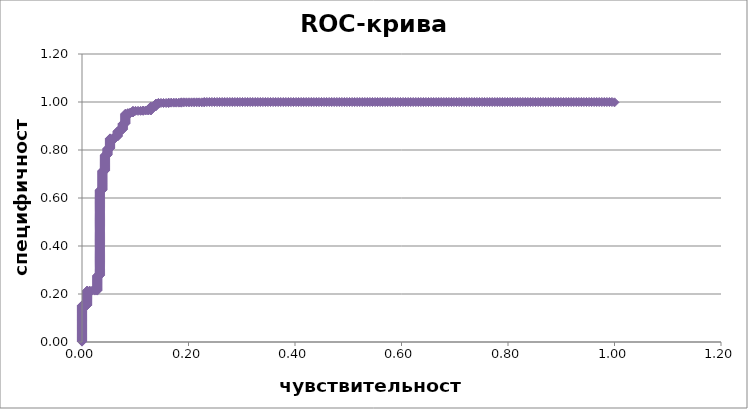
| Category | ROC-кривая |
|---|---|
| 0.0 | 0.001 |
| 0.0 | 0.003 |
| 0.0 | 0.004 |
| 0.0 | 0.005 |
| 0.0 | 0.007 |
| 0.0 | 0.008 |
| 0.0 | 0.01 |
| 0.0 | 0.011 |
| 0.0 | 0.012 |
| 0.0 | 0.014 |
| 0.0 | 0.015 |
| 0.0 | 0.016 |
| 0.0 | 0.018 |
| 0.0 | 0.019 |
| 0.0 | 0.02 |
| 0.0 | 0.022 |
| 0.0 | 0.023 |
| 0.0 | 0.025 |
| 0.0 | 0.026 |
| 0.0 | 0.027 |
| 0.0 | 0.029 |
| 0.0 | 0.03 |
| 0.0 | 0.031 |
| 0.0 | 0.033 |
| 0.0 | 0.034 |
| 0.0 | 0.035 |
| 0.0 | 0.037 |
| 0.0 | 0.038 |
| 0.0 | 0.04 |
| 0.0 | 0.041 |
| 0.0 | 0.042 |
| 0.0 | 0.044 |
| 0.0 | 0.045 |
| 0.0 | 0.046 |
| 0.0 | 0.048 |
| 0.0 | 0.049 |
| 0.0 | 0.05 |
| 0.0 | 0.052 |
| 0.0 | 0.053 |
| 0.0 | 0.055 |
| 0.0 | 0.056 |
| 0.0 | 0.057 |
| 0.0 | 0.059 |
| 0.0 | 0.06 |
| 0.0 | 0.061 |
| 0.0 | 0.063 |
| 0.0 | 0.064 |
| 0.0 | 0.065 |
| 0.0 | 0.067 |
| 0.0 | 0.068 |
| 0.0 | 0.07 |
| 0.0 | 0.071 |
| 0.0 | 0.072 |
| 0.0 | 0.074 |
| 0.0 | 0.075 |
| 0.0 | 0.076 |
| 0.0 | 0.078 |
| 0.0 | 0.079 |
| 0.0 | 0.08 |
| 0.0 | 0.082 |
| 0.0 | 0.083 |
| 0.0 | 0.085 |
| 0.0 | 0.086 |
| 0.0 | 0.087 |
| 0.0 | 0.089 |
| 0.0 | 0.09 |
| 0.0 | 0.091 |
| 0.0 | 0.093 |
| 0.0 | 0.094 |
| 0.0 | 0.095 |
| 0.0 | 0.097 |
| 0.0 | 0.098 |
| 0.0 | 0.1 |
| 0.0 | 0.101 |
| 0.0 | 0.102 |
| 0.0 | 0.104 |
| 0.0 | 0.105 |
| 0.0 | 0.106 |
| 0.0 | 0.108 |
| 0.0 | 0.109 |
| 0.0 | 0.111 |
| 0.0 | 0.112 |
| 0.0 | 0.113 |
| 0.0 | 0.115 |
| 0.0 | 0.116 |
| 0.0 | 0.117 |
| 0.0 | 0.119 |
| 0.0 | 0.12 |
| 0.0 | 0.121 |
| 0.0 | 0.123 |
| 0.0 | 0.124 |
| 0.0 | 0.126 |
| 0.0 | 0.127 |
| 0.0 | 0.128 |
| 0.0 | 0.13 |
| 0.0 | 0.131 |
| 0.0 | 0.132 |
| 0.0 | 0.134 |
| 0.0 | 0.135 |
| 0.0 | 0.136 |
| 0.0 | 0.138 |
| 0.0 | 0.139 |
| 0.0 | 0.141 |
| 0.0 | 0.142 |
| 0.0 | 0.143 |
| 0.0 | 0.145 |
| 0.0 | 0.146 |
| 0.0 | 0.147 |
| 0.0 | 0.149 |
| 0.0 | 0.15 |
| 0.0 | 0.151 |
| 0.0 | 0.153 |
| 0.004784688995215311 | 0.153 |
| 0.009569377990430622 | 0.153 |
| 0.009569377990430622 | 0.154 |
| 0.009569377990430622 | 0.156 |
| 0.009569377990430622 | 0.157 |
| 0.009569377990430622 | 0.158 |
| 0.009569377990430622 | 0.16 |
| 0.009569377990430622 | 0.161 |
| 0.009569377990430622 | 0.162 |
| 0.009569377990430622 | 0.164 |
| 0.009569377990430622 | 0.165 |
| 0.009569377990430622 | 0.166 |
| 0.009569377990430622 | 0.168 |
| 0.009569377990430622 | 0.169 |
| 0.009569377990430622 | 0.171 |
| 0.009569377990430622 | 0.172 |
| 0.009569377990430622 | 0.173 |
| 0.009569377990430622 | 0.175 |
| 0.009569377990430622 | 0.176 |
| 0.009569377990430622 | 0.177 |
| 0.009569377990430622 | 0.179 |
| 0.009569377990430622 | 0.18 |
| 0.009569377990430622 | 0.181 |
| 0.009569377990430622 | 0.183 |
| 0.009569377990430622 | 0.184 |
| 0.009569377990430622 | 0.186 |
| 0.009569377990430622 | 0.187 |
| 0.009569377990430622 | 0.188 |
| 0.009569377990430622 | 0.19 |
| 0.009569377990430622 | 0.191 |
| 0.009569377990430622 | 0.192 |
| 0.009569377990430622 | 0.194 |
| 0.009569377990430622 | 0.195 |
| 0.009569377990430622 | 0.196 |
| 0.009569377990430622 | 0.198 |
| 0.009569377990430622 | 0.199 |
| 0.009569377990430622 | 0.201 |
| 0.009569377990430622 | 0.202 |
| 0.009569377990430622 | 0.203 |
| 0.009569377990430622 | 0.205 |
| 0.009569377990430622 | 0.206 |
| 0.009569377990430622 | 0.207 |
| 0.009569377990430622 | 0.209 |
| 0.009569377990430622 | 0.21 |
| 0.009569377990430622 | 0.211 |
| 0.009569377990430622 | 0.213 |
| 0.009569377990430622 | 0.214 |
| 0.014354066985645933 | 0.214 |
| 0.019138755980861243 | 0.214 |
| 0.023923444976076555 | 0.214 |
| 0.028708133971291867 | 0.214 |
| 0.028708133971291867 | 0.216 |
| 0.028708133971291867 | 0.217 |
| 0.028708133971291867 | 0.218 |
| 0.028708133971291867 | 0.22 |
| 0.028708133971291867 | 0.221 |
| 0.028708133971291867 | 0.222 |
| 0.028708133971291867 | 0.224 |
| 0.028708133971291867 | 0.225 |
| 0.028708133971291867 | 0.226 |
| 0.028708133971291867 | 0.228 |
| 0.028708133971291867 | 0.229 |
| 0.028708133971291867 | 0.231 |
| 0.028708133971291867 | 0.232 |
| 0.028708133971291867 | 0.233 |
| 0.028708133971291867 | 0.235 |
| 0.028708133971291867 | 0.236 |
| 0.028708133971291867 | 0.237 |
| 0.028708133971291867 | 0.239 |
| 0.028708133971291867 | 0.24 |
| 0.028708133971291867 | 0.241 |
| 0.028708133971291867 | 0.243 |
| 0.028708133971291867 | 0.244 |
| 0.028708133971291867 | 0.246 |
| 0.028708133971291867 | 0.247 |
| 0.028708133971291867 | 0.248 |
| 0.028708133971291867 | 0.25 |
| 0.028708133971291867 | 0.251 |
| 0.028708133971291867 | 0.252 |
| 0.028708133971291867 | 0.254 |
| 0.028708133971291867 | 0.255 |
| 0.028708133971291867 | 0.256 |
| 0.028708133971291867 | 0.258 |
| 0.028708133971291867 | 0.259 |
| 0.028708133971291867 | 0.261 |
| 0.028708133971291867 | 0.262 |
| 0.028708133971291867 | 0.263 |
| 0.028708133971291867 | 0.265 |
| 0.028708133971291867 | 0.266 |
| 0.028708133971291867 | 0.267 |
| 0.028708133971291867 | 0.269 |
| 0.028708133971291867 | 0.27 |
| 0.028708133971291867 | 0.271 |
| 0.028708133971291867 | 0.273 |
| 0.028708133971291867 | 0.274 |
| 0.028708133971291867 | 0.276 |
| 0.028708133971291867 | 0.277 |
| 0.03349282296650718 | 0.277 |
| 0.03349282296650718 | 0.278 |
| 0.03349282296650718 | 0.28 |
| 0.03349282296650718 | 0.281 |
| 0.03349282296650718 | 0.282 |
| 0.03349282296650718 | 0.284 |
| 0.03349282296650718 | 0.285 |
| 0.03349282296650718 | 0.286 |
| 0.03349282296650718 | 0.288 |
| 0.03349282296650718 | 0.289 |
| 0.03349282296650718 | 0.291 |
| 0.03349282296650718 | 0.292 |
| 0.03349282296650718 | 0.293 |
| 0.03349282296650718 | 0.295 |
| 0.03349282296650718 | 0.296 |
| 0.03349282296650718 | 0.297 |
| 0.03349282296650718 | 0.299 |
| 0.03349282296650718 | 0.3 |
| 0.03349282296650718 | 0.302 |
| 0.03349282296650718 | 0.303 |
| 0.03349282296650718 | 0.304 |
| 0.03349282296650718 | 0.306 |
| 0.03349282296650718 | 0.307 |
| 0.03349282296650718 | 0.308 |
| 0.03349282296650718 | 0.31 |
| 0.03349282296650718 | 0.311 |
| 0.03349282296650718 | 0.312 |
| 0.03349282296650718 | 0.314 |
| 0.03349282296650718 | 0.315 |
| 0.03349282296650718 | 0.317 |
| 0.03349282296650718 | 0.318 |
| 0.03349282296650718 | 0.319 |
| 0.03349282296650718 | 0.321 |
| 0.03349282296650718 | 0.322 |
| 0.03349282296650718 | 0.323 |
| 0.03349282296650718 | 0.325 |
| 0.03349282296650718 | 0.326 |
| 0.03349282296650718 | 0.327 |
| 0.03349282296650718 | 0.329 |
| 0.03349282296650718 | 0.33 |
| 0.03349282296650718 | 0.332 |
| 0.03349282296650718 | 0.333 |
| 0.03349282296650718 | 0.334 |
| 0.03349282296650718 | 0.336 |
| 0.03349282296650718 | 0.337 |
| 0.03349282296650718 | 0.338 |
| 0.03349282296650718 | 0.34 |
| 0.03349282296650718 | 0.341 |
| 0.03349282296650718 | 0.342 |
| 0.03349282296650718 | 0.344 |
| 0.03349282296650718 | 0.345 |
| 0.03349282296650718 | 0.347 |
| 0.03349282296650718 | 0.348 |
| 0.03349282296650718 | 0.349 |
| 0.03349282296650718 | 0.351 |
| 0.03349282296650718 | 0.352 |
| 0.03349282296650718 | 0.353 |
| 0.03349282296650718 | 0.355 |
| 0.03349282296650718 | 0.356 |
| 0.03349282296650718 | 0.357 |
| 0.03349282296650718 | 0.359 |
| 0.03349282296650718 | 0.36 |
| 0.03349282296650718 | 0.362 |
| 0.03349282296650718 | 0.363 |
| 0.03349282296650718 | 0.364 |
| 0.03349282296650718 | 0.366 |
| 0.03349282296650718 | 0.367 |
| 0.03349282296650718 | 0.368 |
| 0.03349282296650718 | 0.37 |
| 0.03349282296650718 | 0.371 |
| 0.03349282296650718 | 0.372 |
| 0.03349282296650718 | 0.374 |
| 0.03349282296650718 | 0.375 |
| 0.03349282296650718 | 0.377 |
| 0.03349282296650718 | 0.378 |
| 0.03349282296650718 | 0.379 |
| 0.03349282296650718 | 0.381 |
| 0.03349282296650718 | 0.382 |
| 0.03349282296650718 | 0.383 |
| 0.03349282296650718 | 0.385 |
| 0.03349282296650718 | 0.386 |
| 0.03349282296650718 | 0.387 |
| 0.03349282296650718 | 0.389 |
| 0.03349282296650718 | 0.39 |
| 0.03349282296650718 | 0.392 |
| 0.03349282296650718 | 0.393 |
| 0.03349282296650718 | 0.394 |
| 0.03349282296650718 | 0.396 |
| 0.03349282296650718 | 0.397 |
| 0.03349282296650718 | 0.398 |
| 0.03349282296650718 | 0.4 |
| 0.03349282296650718 | 0.401 |
| 0.03349282296650718 | 0.402 |
| 0.03349282296650718 | 0.404 |
| 0.03349282296650718 | 0.405 |
| 0.03349282296650718 | 0.407 |
| 0.03349282296650718 | 0.408 |
| 0.03349282296650718 | 0.409 |
| 0.03349282296650718 | 0.411 |
| 0.03349282296650718 | 0.412 |
| 0.03349282296650718 | 0.413 |
| 0.03349282296650718 | 0.415 |
| 0.03349282296650718 | 0.416 |
| 0.03349282296650718 | 0.417 |
| 0.03349282296650718 | 0.419 |
| 0.03349282296650718 | 0.42 |
| 0.03349282296650718 | 0.422 |
| 0.03349282296650718 | 0.423 |
| 0.03349282296650718 | 0.424 |
| 0.03349282296650718 | 0.426 |
| 0.03349282296650718 | 0.427 |
| 0.03349282296650718 | 0.428 |
| 0.03349282296650718 | 0.43 |
| 0.03349282296650718 | 0.431 |
| 0.03349282296650718 | 0.432 |
| 0.03349282296650718 | 0.434 |
| 0.03349282296650718 | 0.435 |
| 0.03349282296650718 | 0.437 |
| 0.03349282296650718 | 0.438 |
| 0.03349282296650718 | 0.439 |
| 0.03349282296650718 | 0.441 |
| 0.03349282296650718 | 0.442 |
| 0.03349282296650718 | 0.443 |
| 0.03349282296650718 | 0.445 |
| 0.03349282296650718 | 0.446 |
| 0.03349282296650718 | 0.447 |
| 0.03349282296650718 | 0.449 |
| 0.03349282296650718 | 0.45 |
| 0.03349282296650718 | 0.452 |
| 0.03349282296650718 | 0.453 |
| 0.03349282296650718 | 0.454 |
| 0.03349282296650718 | 0.456 |
| 0.03349282296650718 | 0.457 |
| 0.03349282296650718 | 0.458 |
| 0.03349282296650718 | 0.46 |
| 0.03349282296650718 | 0.461 |
| 0.03349282296650718 | 0.462 |
| 0.03349282296650718 | 0.464 |
| 0.03349282296650718 | 0.465 |
| 0.03349282296650718 | 0.467 |
| 0.03349282296650718 | 0.468 |
| 0.03349282296650718 | 0.469 |
| 0.03349282296650718 | 0.471 |
| 0.03349282296650718 | 0.472 |
| 0.03349282296650718 | 0.473 |
| 0.03349282296650718 | 0.475 |
| 0.03349282296650718 | 0.476 |
| 0.03349282296650718 | 0.477 |
| 0.03349282296650718 | 0.479 |
| 0.03349282296650718 | 0.48 |
| 0.03349282296650718 | 0.482 |
| 0.03349282296650718 | 0.483 |
| 0.03349282296650718 | 0.484 |
| 0.03349282296650718 | 0.486 |
| 0.03349282296650718 | 0.487 |
| 0.03349282296650718 | 0.488 |
| 0.03349282296650718 | 0.49 |
| 0.03349282296650718 | 0.491 |
| 0.03349282296650718 | 0.492 |
| 0.03349282296650718 | 0.494 |
| 0.03349282296650718 | 0.495 |
| 0.03349282296650718 | 0.497 |
| 0.03349282296650718 | 0.498 |
| 0.03349282296650718 | 0.499 |
| 0.03349282296650718 | 0.501 |
| 0.03349282296650718 | 0.502 |
| 0.03349282296650718 | 0.503 |
| 0.03349282296650718 | 0.505 |
| 0.03349282296650718 | 0.506 |
| 0.03349282296650718 | 0.508 |
| 0.03349282296650718 | 0.509 |
| 0.03349282296650718 | 0.51 |
| 0.03349282296650718 | 0.512 |
| 0.03349282296650718 | 0.513 |
| 0.03349282296650718 | 0.514 |
| 0.03349282296650718 | 0.516 |
| 0.03349282296650718 | 0.517 |
| 0.03349282296650718 | 0.518 |
| 0.03349282296650718 | 0.52 |
| 0.03349282296650718 | 0.521 |
| 0.03349282296650718 | 0.523 |
| 0.03349282296650718 | 0.524 |
| 0.03349282296650718 | 0.525 |
| 0.03349282296650718 | 0.527 |
| 0.03349282296650718 | 0.528 |
| 0.03349282296650718 | 0.529 |
| 0.03349282296650718 | 0.531 |
| 0.03349282296650718 | 0.532 |
| 0.03349282296650718 | 0.533 |
| 0.03349282296650718 | 0.535 |
| 0.03349282296650718 | 0.536 |
| 0.03349282296650718 | 0.538 |
| 0.03349282296650718 | 0.539 |
| 0.03349282296650718 | 0.54 |
| 0.03349282296650718 | 0.542 |
| 0.03349282296650718 | 0.543 |
| 0.03349282296650718 | 0.544 |
| 0.03349282296650718 | 0.546 |
| 0.03349282296650718 | 0.547 |
| 0.03349282296650718 | 0.548 |
| 0.03349282296650718 | 0.55 |
| 0.03349282296650718 | 0.551 |
| 0.03349282296650718 | 0.553 |
| 0.03349282296650718 | 0.554 |
| 0.03349282296650718 | 0.555 |
| 0.03349282296650718 | 0.557 |
| 0.03349282296650718 | 0.558 |
| 0.03349282296650718 | 0.559 |
| 0.03349282296650718 | 0.561 |
| 0.03349282296650718 | 0.562 |
| 0.03349282296650718 | 0.563 |
| 0.03349282296650718 | 0.565 |
| 0.03349282296650718 | 0.566 |
| 0.03349282296650718 | 0.568 |
| 0.03349282296650718 | 0.569 |
| 0.03349282296650718 | 0.57 |
| 0.03349282296650718 | 0.572 |
| 0.03349282296650718 | 0.573 |
| 0.03349282296650718 | 0.574 |
| 0.03349282296650718 | 0.576 |
| 0.03349282296650718 | 0.577 |
| 0.03349282296650718 | 0.578 |
| 0.03349282296650718 | 0.58 |
| 0.03349282296650718 | 0.581 |
| 0.03349282296650718 | 0.583 |
| 0.03349282296650718 | 0.584 |
| 0.03349282296650718 | 0.585 |
| 0.03349282296650718 | 0.587 |
| 0.03349282296650718 | 0.588 |
| 0.03349282296650718 | 0.589 |
| 0.03349282296650718 | 0.591 |
| 0.03349282296650718 | 0.592 |
| 0.03349282296650718 | 0.593 |
| 0.03349282296650718 | 0.595 |
| 0.03349282296650718 | 0.596 |
| 0.03349282296650718 | 0.598 |
| 0.03349282296650718 | 0.599 |
| 0.03349282296650718 | 0.6 |
| 0.03349282296650718 | 0.602 |
| 0.03349282296650718 | 0.603 |
| 0.03349282296650718 | 0.604 |
| 0.03349282296650718 | 0.606 |
| 0.03349282296650718 | 0.607 |
| 0.03349282296650718 | 0.608 |
| 0.03349282296650718 | 0.61 |
| 0.03349282296650718 | 0.611 |
| 0.03349282296650718 | 0.613 |
| 0.03349282296650718 | 0.614 |
| 0.03349282296650718 | 0.615 |
| 0.03349282296650718 | 0.617 |
| 0.03349282296650718 | 0.618 |
| 0.03349282296650718 | 0.619 |
| 0.03349282296650718 | 0.621 |
| 0.03349282296650718 | 0.622 |
| 0.03349282296650718 | 0.623 |
| 0.03349282296650718 | 0.625 |
| 0.03349282296650718 | 0.626 |
| 0.03349282296650718 | 0.628 |
| 0.03349282296650718 | 0.629 |
| 0.03349282296650718 | 0.63 |
| 0.03349282296650718 | 0.632 |
| 0.03349282296650718 | 0.633 |
| 0.03827751196172249 | 0.633 |
| 0.03827751196172249 | 0.634 |
| 0.03827751196172249 | 0.636 |
| 0.03827751196172249 | 0.637 |
| 0.03827751196172249 | 0.638 |
| 0.03827751196172249 | 0.64 |
| 0.03827751196172249 | 0.641 |
| 0.03827751196172249 | 0.643 |
| 0.03827751196172249 | 0.644 |
| 0.03827751196172249 | 0.645 |
| 0.03827751196172249 | 0.647 |
| 0.03827751196172249 | 0.648 |
| 0.03827751196172249 | 0.649 |
| 0.03827751196172249 | 0.651 |
| 0.03827751196172249 | 0.652 |
| 0.03827751196172249 | 0.653 |
| 0.03827751196172249 | 0.655 |
| 0.03827751196172249 | 0.656 |
| 0.03827751196172249 | 0.658 |
| 0.03827751196172249 | 0.659 |
| 0.03827751196172249 | 0.66 |
| 0.03827751196172249 | 0.662 |
| 0.03827751196172249 | 0.663 |
| 0.03827751196172249 | 0.664 |
| 0.03827751196172249 | 0.666 |
| 0.03827751196172249 | 0.667 |
| 0.03827751196172249 | 0.668 |
| 0.03827751196172249 | 0.67 |
| 0.03827751196172249 | 0.671 |
| 0.03827751196172249 | 0.673 |
| 0.03827751196172249 | 0.674 |
| 0.03827751196172249 | 0.675 |
| 0.03827751196172249 | 0.677 |
| 0.03827751196172249 | 0.678 |
| 0.03827751196172249 | 0.679 |
| 0.03827751196172249 | 0.681 |
| 0.03827751196172249 | 0.682 |
| 0.03827751196172249 | 0.683 |
| 0.03827751196172249 | 0.685 |
| 0.03827751196172249 | 0.686 |
| 0.03827751196172249 | 0.688 |
| 0.03827751196172249 | 0.689 |
| 0.03827751196172249 | 0.69 |
| 0.03827751196172249 | 0.692 |
| 0.03827751196172249 | 0.693 |
| 0.03827751196172249 | 0.694 |
| 0.03827751196172249 | 0.696 |
| 0.03827751196172249 | 0.697 |
| 0.03827751196172249 | 0.698 |
| 0.03827751196172249 | 0.7 |
| 0.03827751196172249 | 0.701 |
| 0.03827751196172249 | 0.703 |
| 0.03827751196172249 | 0.704 |
| 0.03827751196172249 | 0.705 |
| 0.03827751196172249 | 0.707 |
| 0.03827751196172249 | 0.708 |
| 0.03827751196172249 | 0.709 |
| 0.03827751196172249 | 0.711 |
| 0.03827751196172249 | 0.712 |
| 0.03827751196172249 | 0.714 |
| 0.0430622009569378 | 0.714 |
| 0.0430622009569378 | 0.715 |
| 0.0430622009569378 | 0.716 |
| 0.0430622009569378 | 0.718 |
| 0.0430622009569378 | 0.719 |
| 0.0430622009569378 | 0.72 |
| 0.0430622009569378 | 0.722 |
| 0.0430622009569378 | 0.723 |
| 0.0430622009569378 | 0.724 |
| 0.0430622009569378 | 0.726 |
| 0.0430622009569378 | 0.727 |
| 0.0430622009569378 | 0.729 |
| 0.0430622009569378 | 0.73 |
| 0.0430622009569378 | 0.731 |
| 0.0430622009569378 | 0.733 |
| 0.0430622009569378 | 0.734 |
| 0.0430622009569378 | 0.735 |
| 0.0430622009569378 | 0.737 |
| 0.0430622009569378 | 0.738 |
| 0.0430622009569378 | 0.739 |
| 0.0430622009569378 | 0.741 |
| 0.0430622009569378 | 0.742 |
| 0.0430622009569378 | 0.744 |
| 0.0430622009569378 | 0.745 |
| 0.0430622009569378 | 0.746 |
| 0.0430622009569378 | 0.748 |
| 0.0430622009569378 | 0.749 |
| 0.0430622009569378 | 0.75 |
| 0.0430622009569378 | 0.752 |
| 0.0430622009569378 | 0.753 |
| 0.0430622009569378 | 0.754 |
| 0.0430622009569378 | 0.756 |
| 0.0430622009569378 | 0.757 |
| 0.0430622009569378 | 0.759 |
| 0.0430622009569378 | 0.76 |
| 0.0430622009569378 | 0.761 |
| 0.0430622009569378 | 0.763 |
| 0.0430622009569378 | 0.764 |
| 0.0430622009569378 | 0.765 |
| 0.0430622009569378 | 0.767 |
| 0.0430622009569378 | 0.768 |
| 0.0430622009569378 | 0.769 |
| 0.0430622009569378 | 0.771 |
| 0.0430622009569378 | 0.772 |
| 0.0430622009569378 | 0.774 |
| 0.0430622009569378 | 0.775 |
| 0.0430622009569378 | 0.776 |
| 0.0430622009569378 | 0.778 |
| 0.0430622009569378 | 0.779 |
| 0.04784688995215311 | 0.779 |
| 0.04784688995215311 | 0.78 |
| 0.04784688995215311 | 0.782 |
| 0.04784688995215311 | 0.783 |
| 0.04784688995215311 | 0.784 |
| 0.04784688995215311 | 0.786 |
| 0.04784688995215311 | 0.787 |
| 0.04784688995215311 | 0.789 |
| 0.04784688995215311 | 0.79 |
| 0.04784688995215311 | 0.791 |
| 0.04784688995215311 | 0.793 |
| 0.04784688995215311 | 0.794 |
| 0.04784688995215311 | 0.795 |
| 0.04784688995215311 | 0.797 |
| 0.04784688995215311 | 0.798 |
| 0.04784688995215311 | 0.799 |
| 0.04784688995215311 | 0.801 |
| 0.04784688995215311 | 0.802 |
| 0.04784688995215311 | 0.804 |
| 0.04784688995215311 | 0.805 |
| 0.04784688995215311 | 0.806 |
| 0.05263157894736842 | 0.806 |
| 0.05263157894736842 | 0.808 |
| 0.05263157894736842 | 0.809 |
| 0.05263157894736842 | 0.81 |
| 0.05263157894736842 | 0.812 |
| 0.05263157894736842 | 0.813 |
| 0.05263157894736842 | 0.814 |
| 0.05263157894736842 | 0.816 |
| 0.05263157894736842 | 0.817 |
| 0.05263157894736842 | 0.819 |
| 0.05263157894736842 | 0.82 |
| 0.05263157894736842 | 0.821 |
| 0.05263157894736842 | 0.823 |
| 0.05263157894736842 | 0.824 |
| 0.05263157894736842 | 0.825 |
| 0.05263157894736842 | 0.827 |
| 0.05263157894736842 | 0.828 |
| 0.05263157894736842 | 0.829 |
| 0.05263157894736842 | 0.831 |
| 0.05263157894736842 | 0.832 |
| 0.05263157894736842 | 0.834 |
| 0.05263157894736842 | 0.835 |
| 0.05263157894736842 | 0.836 |
| 0.05263157894736842 | 0.838 |
| 0.05263157894736842 | 0.839 |
| 0.05263157894736842 | 0.84 |
| 0.05263157894736842 | 0.842 |
| 0.05263157894736842 | 0.843 |
| 0.05263157894736842 | 0.844 |
| 0.05263157894736842 | 0.846 |
| 0.05263157894736842 | 0.847 |
| 0.05263157894736842 | 0.849 |
| 0.05741626794258373 | 0.849 |
| 0.06220095693779904 | 0.849 |
| 0.06220095693779904 | 0.85 |
| 0.06220095693779904 | 0.851 |
| 0.06220095693779904 | 0.853 |
| 0.06220095693779904 | 0.854 |
| 0.06220095693779904 | 0.855 |
| 0.06220095693779904 | 0.857 |
| 0.06698564593301436 | 0.857 |
| 0.06698564593301436 | 0.858 |
| 0.06698564593301436 | 0.859 |
| 0.06698564593301436 | 0.861 |
| 0.06698564593301436 | 0.862 |
| 0.06698564593301436 | 0.864 |
| 0.06698564593301436 | 0.865 |
| 0.06698564593301436 | 0.866 |
| 0.06698564593301436 | 0.868 |
| 0.06698564593301436 | 0.869 |
| 0.06698564593301436 | 0.87 |
| 0.06698564593301436 | 0.872 |
| 0.06698564593301436 | 0.873 |
| 0.06698564593301436 | 0.874 |
| 0.06698564593301436 | 0.876 |
| 0.06698564593301436 | 0.877 |
| 0.06698564593301436 | 0.879 |
| 0.07177033492822966 | 0.879 |
| 0.07177033492822966 | 0.88 |
| 0.07177033492822966 | 0.881 |
| 0.07177033492822966 | 0.883 |
| 0.07177033492822966 | 0.884 |
| 0.07177033492822966 | 0.885 |
| 0.07655502392344497 | 0.885 |
| 0.07655502392344497 | 0.887 |
| 0.07655502392344497 | 0.888 |
| 0.07655502392344497 | 0.889 |
| 0.07655502392344497 | 0.891 |
| 0.07655502392344497 | 0.892 |
| 0.07655502392344497 | 0.894 |
| 0.07655502392344497 | 0.895 |
| 0.07655502392344497 | 0.896 |
| 0.07655502392344497 | 0.898 |
| 0.07655502392344497 | 0.899 |
| 0.07655502392344497 | 0.9 |
| 0.07655502392344497 | 0.902 |
| 0.07655502392344497 | 0.903 |
| 0.07655502392344497 | 0.905 |
| 0.07655502392344497 | 0.906 |
| 0.07655502392344497 | 0.907 |
| 0.07655502392344497 | 0.909 |
| 0.07655502392344497 | 0.91 |
| 0.08133971291866028 | 0.91 |
| 0.08133971291866028 | 0.911 |
| 0.08133971291866028 | 0.913 |
| 0.08133971291866028 | 0.914 |
| 0.08133971291866028 | 0.915 |
| 0.08133971291866028 | 0.917 |
| 0.08133971291866028 | 0.918 |
| 0.08133971291866028 | 0.92 |
| 0.08133971291866028 | 0.921 |
| 0.08133971291866028 | 0.922 |
| 0.08133971291866028 | 0.924 |
| 0.08133971291866028 | 0.925 |
| 0.08133971291866028 | 0.926 |
| 0.08133971291866028 | 0.928 |
| 0.08133971291866028 | 0.929 |
| 0.08133971291866028 | 0.93 |
| 0.08133971291866028 | 0.932 |
| 0.08133971291866028 | 0.933 |
| 0.08133971291866028 | 0.935 |
| 0.08133971291866028 | 0.936 |
| 0.08133971291866028 | 0.937 |
| 0.08133971291866028 | 0.939 |
| 0.08133971291866028 | 0.94 |
| 0.08133971291866028 | 0.941 |
| 0.08133971291866028 | 0.943 |
| 0.08133971291866028 | 0.944 |
| 0.08133971291866028 | 0.945 |
| 0.08133971291866028 | 0.947 |
| 0.08133971291866028 | 0.948 |
| 0.08133971291866028 | 0.95 |
| 0.08133971291866028 | 0.951 |
| 0.0861244019138756 | 0.951 |
| 0.0861244019138756 | 0.952 |
| 0.0861244019138756 | 0.954 |
| 0.09090909090909091 | 0.954 |
| 0.09090909090909091 | 0.955 |
| 0.09090909090909091 | 0.956 |
| 0.09569377990430622 | 0.956 |
| 0.09569377990430622 | 0.958 |
| 0.09569377990430622 | 0.959 |
| 0.09569377990430622 | 0.96 |
| 0.09569377990430622 | 0.962 |
| 0.09569377990430622 | 0.963 |
| 0.10047846889952153 | 0.963 |
| 0.10526315789473684 | 0.963 |
| 0.11004784688995216 | 0.963 |
| 0.11483253588516747 | 0.963 |
| 0.11483253588516747 | 0.965 |
| 0.11961722488038277 | 0.965 |
| 0.12440191387559808 | 0.965 |
| 0.1291866028708134 | 0.965 |
| 0.1291866028708134 | 0.966 |
| 0.1291866028708134 | 0.967 |
| 0.1291866028708134 | 0.969 |
| 0.1291866028708134 | 0.97 |
| 0.1291866028708134 | 0.971 |
| 0.1291866028708134 | 0.973 |
| 0.1291866028708134 | 0.974 |
| 0.1291866028708134 | 0.975 |
| 0.1291866028708134 | 0.977 |
| 0.1291866028708134 | 0.978 |
| 0.1291866028708134 | 0.98 |
| 0.1291866028708134 | 0.981 |
| 0.1339712918660287 | 0.981 |
| 0.1339712918660287 | 0.982 |
| 0.13875598086124402 | 0.982 |
| 0.13875598086124402 | 0.984 |
| 0.13875598086124402 | 0.985 |
| 0.13875598086124402 | 0.986 |
| 0.13875598086124402 | 0.988 |
| 0.13875598086124402 | 0.989 |
| 0.13875598086124402 | 0.99 |
| 0.13875598086124402 | 0.992 |
| 0.13875598086124402 | 0.993 |
| 0.14354066985645933 | 0.993 |
| 0.14354066985645933 | 0.995 |
| 0.14354066985645933 | 0.996 |
| 0.14832535885167464 | 0.996 |
| 0.15311004784688995 | 0.996 |
| 0.15789473684210525 | 0.996 |
| 0.16267942583732056 | 0.996 |
| 0.16267942583732056 | 0.997 |
| 0.1674641148325359 | 0.997 |
| 0.1722488038277512 | 0.997 |
| 0.17703349282296652 | 0.997 |
| 0.18181818181818182 | 0.997 |
| 0.18660287081339713 | 0.997 |
| 0.18660287081339713 | 0.999 |
| 0.19138755980861244 | 0.999 |
| 0.19617224880382775 | 0.999 |
| 0.20095693779904306 | 0.999 |
| 0.20574162679425836 | 0.999 |
| 0.21052631578947367 | 0.999 |
| 0.215311004784689 | 0.999 |
| 0.22009569377990432 | 0.999 |
| 0.22488038277511962 | 0.999 |
| 0.22966507177033493 | 0.999 |
| 0.22966507177033493 | 1 |
| 0.23444976076555024 | 1 |
| 0.23923444976076555 | 1 |
| 0.24401913875598086 | 1 |
| 0.24880382775119617 | 1 |
| 0.2535885167464115 | 1 |
| 0.2583732057416268 | 1 |
| 0.2631578947368421 | 1 |
| 0.2679425837320574 | 1 |
| 0.2727272727272727 | 1 |
| 0.27751196172248804 | 1 |
| 0.2822966507177033 | 1 |
| 0.28708133971291866 | 1 |
| 0.291866028708134 | 1 |
| 0.2966507177033493 | 1 |
| 0.3014354066985646 | 1 |
| 0.3062200956937799 | 1 |
| 0.31100478468899523 | 1 |
| 0.3157894736842105 | 1 |
| 0.32057416267942584 | 1 |
| 0.3253588516746411 | 1 |
| 0.33014354066985646 | 1 |
| 0.3349282296650718 | 1 |
| 0.3397129186602871 | 1 |
| 0.3444976076555024 | 1 |
| 0.3492822966507177 | 1 |
| 0.35406698564593303 | 1 |
| 0.3588516746411483 | 1 |
| 0.36363636363636365 | 1 |
| 0.3684210526315789 | 1 |
| 0.37320574162679426 | 1 |
| 0.37799043062200954 | 1 |
| 0.3827751196172249 | 1 |
| 0.3875598086124402 | 1 |
| 0.3923444976076555 | 1 |
| 0.39712918660287083 | 1 |
| 0.4019138755980861 | 1 |
| 0.40669856459330145 | 1 |
| 0.41148325358851673 | 1 |
| 0.41626794258373206 | 1 |
| 0.42105263157894735 | 1 |
| 0.4258373205741627 | 1 |
| 0.430622009569378 | 1 |
| 0.4354066985645933 | 1 |
| 0.44019138755980863 | 1 |
| 0.4449760765550239 | 1 |
| 0.44976076555023925 | 1 |
| 0.45454545454545453 | 1 |
| 0.45933014354066987 | 1 |
| 0.46411483253588515 | 1 |
| 0.4688995215311005 | 1 |
| 0.47368421052631576 | 1 |
| 0.4784688995215311 | 1 |
| 0.48325358851674644 | 1 |
| 0.4880382775119617 | 1 |
| 0.49282296650717705 | 1 |
| 0.49760765550239233 | 1 |
| 0.5023923444976076 | 1 |
| 0.507177033492823 | 1 |
| 0.5119617224880383 | 1 |
| 0.5167464114832536 | 1 |
| 0.5215311004784688 | 1 |
| 0.5263157894736842 | 1 |
| 0.5311004784688995 | 1 |
| 0.5358851674641149 | 1 |
| 0.5406698564593302 | 1 |
| 0.5454545454545454 | 1 |
| 0.5502392344497608 | 1 |
| 0.5550239234449761 | 1 |
| 0.5598086124401914 | 1 |
| 0.5645933014354066 | 1 |
| 0.569377990430622 | 1 |
| 0.5741626794258373 | 1 |
| 0.5789473684210527 | 1 |
| 0.583732057416268 | 1 |
| 0.5885167464114832 | 1 |
| 0.5933014354066986 | 1 |
| 0.5980861244019139 | 1 |
| 0.6028708133971292 | 1 |
| 0.6076555023923444 | 1 |
| 0.6124401913875598 | 1 |
| 0.6172248803827751 | 1 |
| 0.6220095693779905 | 1 |
| 0.6267942583732058 | 1 |
| 0.631578947368421 | 1 |
| 0.6363636363636364 | 1 |
| 0.6411483253588517 | 1 |
| 0.645933014354067 | 1 |
| 0.6507177033492823 | 1 |
| 0.6555023923444976 | 1 |
| 0.6602870813397129 | 1 |
| 0.6650717703349283 | 1 |
| 0.6698564593301436 | 1 |
| 0.6746411483253588 | 1 |
| 0.6794258373205742 | 1 |
| 0.6842105263157895 | 1 |
| 0.6889952153110048 | 1 |
| 0.69377990430622 | 1 |
| 0.6985645933014354 | 1 |
| 0.7033492822966507 | 1 |
| 0.7081339712918661 | 1 |
| 0.7129186602870813 | 1 |
| 0.7177033492822966 | 1 |
| 0.722488038277512 | 1 |
| 0.7272727272727273 | 1 |
| 0.7320574162679426 | 1 |
| 0.7368421052631579 | 1 |
| 0.7416267942583732 | 1 |
| 0.7464114832535885 | 1 |
| 0.7511961722488039 | 1 |
| 0.7559808612440191 | 1 |
| 0.7607655502392344 | 1 |
| 0.7655502392344498 | 1 |
| 0.7703349282296651 | 1 |
| 0.7751196172248804 | 1 |
| 0.7799043062200957 | 1 |
| 0.784688995215311 | 1 |
| 0.7894736842105263 | 1 |
| 0.7942583732057417 | 1 |
| 0.7990430622009569 | 1 |
| 0.8038277511961722 | 1 |
| 0.8086124401913876 | 1 |
| 0.8133971291866029 | 1 |
| 0.8181818181818182 | 1 |
| 0.8229665071770335 | 1 |
| 0.8277511961722488 | 1 |
| 0.8325358851674641 | 1 |
| 0.8373205741626795 | 1 |
| 0.8421052631578947 | 1 |
| 0.84688995215311 | 1 |
| 0.8516746411483254 | 1 |
| 0.8564593301435407 | 1 |
| 0.861244019138756 | 1 |
| 0.8660287081339713 | 1 |
| 0.8708133971291866 | 1 |
| 0.8755980861244019 | 1 |
| 0.8803827751196173 | 1 |
| 0.8851674641148325 | 1 |
| 0.8899521531100478 | 1 |
| 0.8947368421052632 | 1 |
| 0.8995215311004785 | 1 |
| 0.9043062200956937 | 1 |
| 0.9090909090909091 | 1 |
| 0.9138755980861244 | 1 |
| 0.9186602870813397 | 1 |
| 0.9234449760765551 | 1 |
| 0.9282296650717703 | 1 |
| 0.9330143540669856 | 1 |
| 0.937799043062201 | 1 |
| 0.9425837320574163 | 1 |
| 0.9473684210526315 | 1 |
| 0.9521531100478469 | 1 |
| 0.9569377990430622 | 1 |
| 0.9617224880382775 | 1 |
| 0.9665071770334929 | 1 |
| 0.9712918660287081 | 1 |
| 0.9760765550239234 | 1 |
| 0.9808612440191388 | 1 |
| 0.9856459330143541 | 1 |
| 0.9904306220095693 | 1 |
| 0.9952153110047847 | 1 |
| 1.0 | 0.999 |